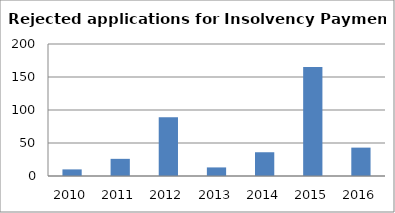
| Category | Series 0 |
|---|---|
| 2010.0 | 10 |
| 2011.0 | 26 |
| 2012.0 | 89 |
| 2013.0 | 13 |
| 2014.0 | 36 |
| 2015.0 | 165 |
| 2016.0 | 43 |